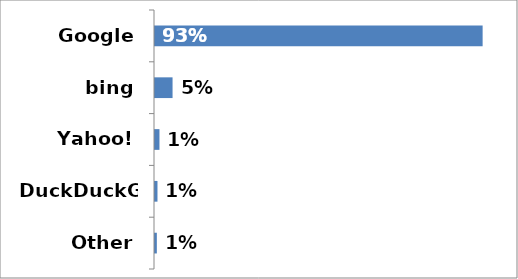
| Category | Share |
|---|---|
| Google | 0.926 |
| bing | 0.05 |
| Yahoo! | 0.013 |
| DuckDuckGo | 0.007 |
| Other | 0.005 |